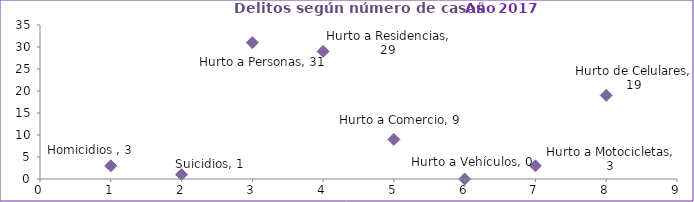
| Category | Series 0 |
|---|---|
| 0 | 3 |
| 1 | 1 |
| 2 | 31 |
| 3 | 29 |
| 4 | 9 |
| 5 | 0 |
| 6 | 3 |
| 7 | 19 |